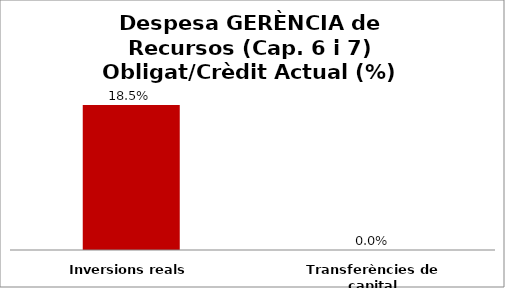
| Category | Series 0 |
|---|---|
| Inversions reals | 0.185 |
| Transferències de capital | 0 |